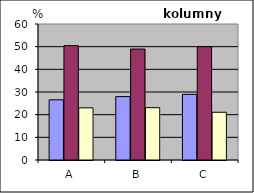
| Category | Series 0 | Series 1 | Series 2 |
|---|---|---|---|
| 0 | 26.549 | 50.442 | 23.009 |
| 1 | 27.972 | 48.951 | 23.077 |
| 2 | 28.947 | 50 | 21.053 |